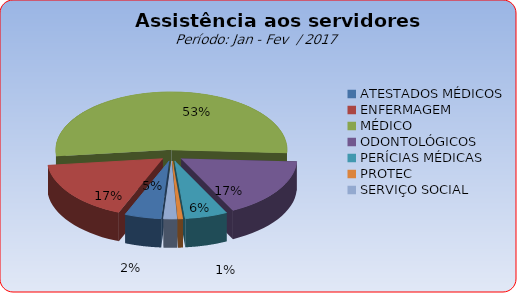
| Category | Series 0 |
|---|---|
| ATESTADOS MÉDICOS | 5.093 |
| ENFERMAGEM | 16.978 |
| MÉDICO | 52.632 |
| ODONTOLÓGICOS | 16.808 |
| PERÍCIAS MÉDICAS | 5.942 |
| PROTEC | 0.679 |
| SERVIÇO SOCIAL | 1.868 |